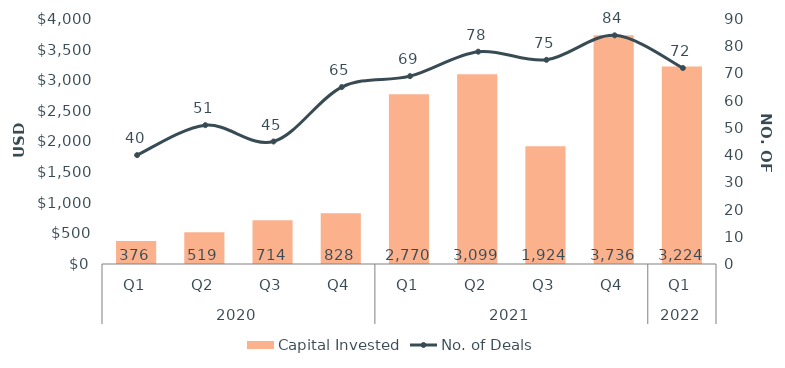
| Category | Capital Invested |
|---|---|
| 0 | 376.247 |
| 1 | 519.021 |
| 2 | 713.762 |
| 3 | 828.027 |
| 4 | 2769.784 |
| 5 | 3099.02 |
| 6 | 1923.696 |
| 7 | 3735.526 |
| 8 | 3224.167 |